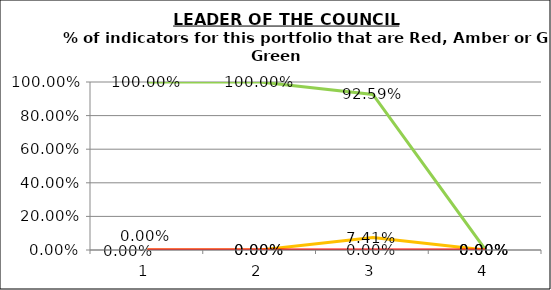
| Category | Green | Amber | Red |
|---|---|---|---|
| 0 | 1 | 0 | 0 |
| 1 | 1 | 0 | 0 |
| 2 | 0.926 | 0.074 | 0 |
| 3 | 0 | 0 | 0 |